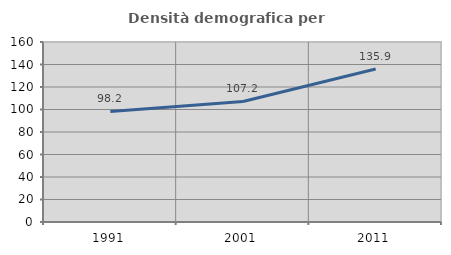
| Category | Densità demografica |
|---|---|
| 1991.0 | 98.245 |
| 2001.0 | 107.156 |
| 2011.0 | 135.944 |